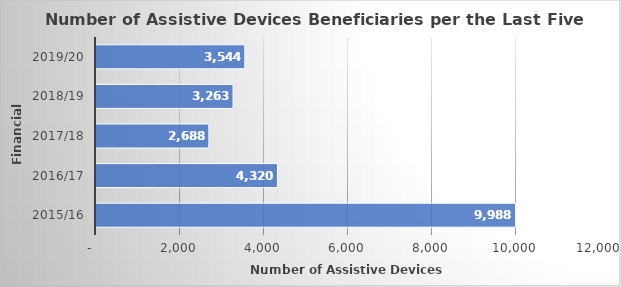
| Category |  GRAND TOTAL  |
|---|---|
| 2015/16 | 9988 |
| 2016/17 | 4320 |
| 2017/18 | 2688 |
| 2018/19 | 3263 |
| 2019/20 | 3544 |